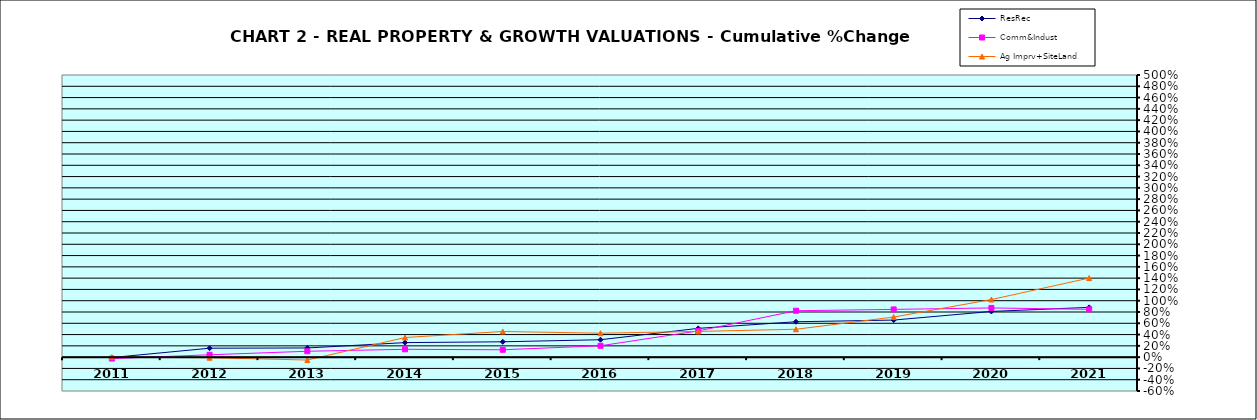
| Category | ResRec | Comm&Indust | Ag Imprv+SiteLand |
|---|---|---|---|
| 2011.0 | -0.007 | -0.026 | 0 |
| 2012.0 | 0.158 | 0.042 | -0.01 |
| 2013.0 | 0.163 | 0.104 | -0.051 |
| 2014.0 | 0.257 | 0.139 | 0.348 |
| 2015.0 | 0.272 | 0.131 | 0.455 |
| 2016.0 | 0.309 | 0.201 | 0.424 |
| 2017.0 | 0.51 | 0.464 | 0.456 |
| 2018.0 | 0.627 | 0.822 | 0.494 |
| 2019.0 | 0.657 | 0.846 | 0.711 |
| 2020.0 | 0.81 | 0.872 | 1.021 |
| 2021.0 | 0.882 | 0.847 | 1.401 |